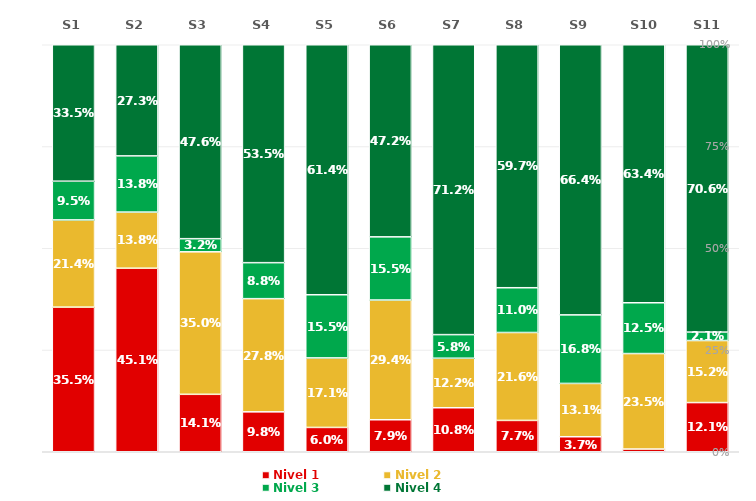
| Category | Nivel 1 | Nivel 2 | Nivel 3 | Nivel 4 |
|---|---|---|---|---|
| S1 | 0.355 | 0.214 | 0.095 | 0.335 |
| S2 | 0.451 | 0.138 | 0.138 | 0.273 |
| S3 | 0.141 | 0.35 | 0.032 | 0.476 |
| S4 | 0.098 | 0.278 | 0.088 | 0.535 |
| S5 | 0.06 | 0.171 | 0.155 | 0.614 |
| S6 | 0.079 | 0.294 | 0.155 | 0.472 |
| S7 | 0.108 | 0.122 | 0.058 | 0.712 |
| S8 | 0.077 | 0.216 | 0.11 | 0.597 |
| S9 | 0.037 | 0.131 | 0.168 | 0.664 |
| S10 | 0.007 | 0.235 | 0.125 | 0.634 |
| S11 | 0.121 | 0.152 | 0.021 | 0.706 |